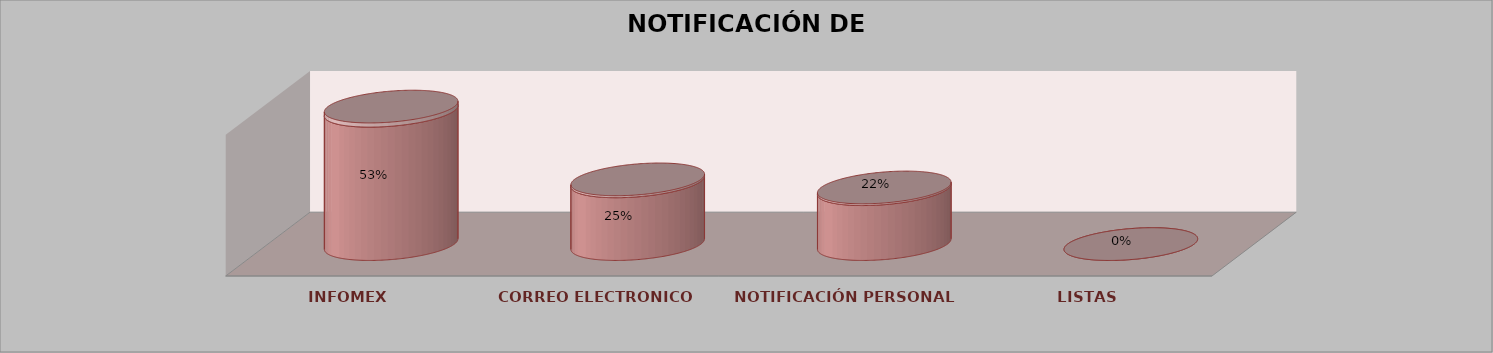
| Category | Series 0 | Series 1 | Series 2 | Series 3 | Series 4 |
|---|---|---|---|---|---|
| INFOMEX |  |  |  | 17 | 0.531 |
| CORREO ELECTRONICO |  |  |  | 8 | 0.25 |
| NOTIFICACIÓN PERSONAL |  |  |  | 7 | 0.219 |
| LISTAS |  |  |  | 0 | 0 |